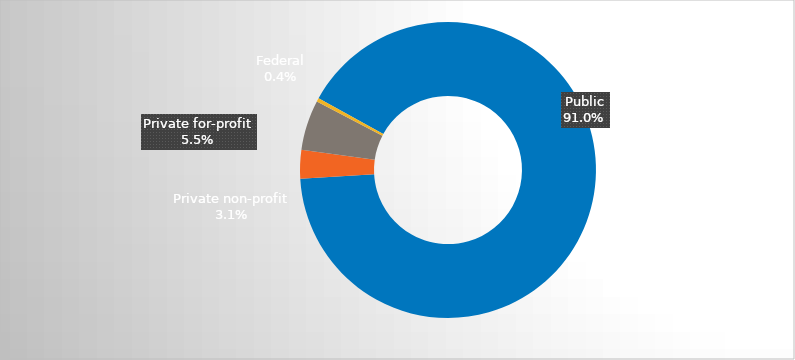
| Category | Series 0 |
|---|---|
| Public | 0.91 |
| Private non-profit | 0.031 |
| Private for-profit | 0.055 |
| Federal | 0.004 |